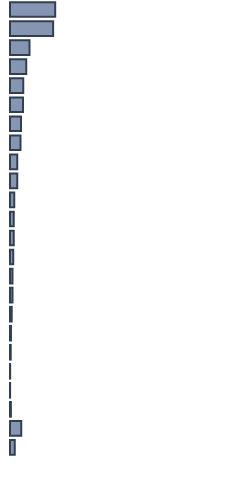
| Category | Series 0 |
|---|---|
| 0 | 19.907 |
| 1 | 19.008 |
| 2 | 8.601 |
| 3 | 7.205 |
| 4 | 5.839 |
| 5 | 5.721 |
| 6 | 4.888 |
| 7 | 4.585 |
| 8 | 3.209 |
| 9 | 3.209 |
| 10 | 1.866 |
| 11 | 1.626 |
| 12 | 1.619 |
| 13 | 1.407 |
| 14 | 1.143 |
| 15 | 1.118 |
| 16 | 0.751 |
| 17 | 0.428 |
| 18 | 0.328 |
| 19 | 0.062 |
| 20 | 0.043 |
| 21 | 0.397 |
| 22 | 4.908 |
| 23 | 2.132 |
| 24 | 0 |